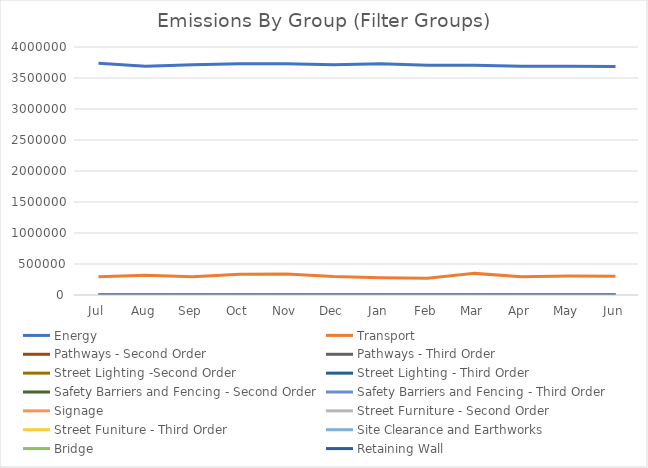
| Category | Energy | Transport | Pathways - Second Order | Pathways - Third Order | Street Lighting -Second Order | Street Lighting - Third Order | Safety Barriers and Fencing - Second Order | Safety Barriers and Fencing - Third Order | Signage | Street Furniture - Second Order | Street Funiture - Third Order | Site Clearance and Earthworks | Bridge | Retaining Wall |
|---|---|---|---|---|---|---|---|---|---|---|---|---|---|---|
| Jul | 3739475.92 | 295843.133 | 0 | 170.31 | 0 | 0 | 0 | 0 | 0 | 0 | 0 | 0 | 0 | 0 |
| Aug | 3689571.545 | 319998.625 | 0 | 1483 | 0 | 0 | 0 | 0 | 0 | 0 | 0 | 0 | 0 | 0 |
| Sep | 3714832.63 | 294915.596 | 0 | 1526 | 0 | 0 | 0 | 0 | 0 | 0 | 0 | 0 | 0 | 0 |
| Oct | 3731551.888 | 333237.089 | 0 | 6950 | 0 | 0 | 0 | 0 | 0 | 0 | 0 | 0 | 0 | 0 |
| Nov | 3729217.409 | 337195.329 | 0 | 5793 | 0 | 0 | 0 | 0 | 0 | 0 | 0 | 0 | 0 | 0 |
| Dec | 3712976.42 | 296564.337 | 0 | 1950 | 0 | 0 | 0 | 0 | 0 | 0 | 0 | 0 | 0 | 0 |
| Jan | 3730426.992 | 278044.453 | 0 | 4700 | 0 | 0 | 0 | 0 | 0 | 0 | 0 | 0 | 0 | 0 |
| Feb | 3703645.334 | 271372.331 | 0 | 8155 | 0 | 0 | 0 | 0 | 0 | 0 | 0 | 0 | 0 | 0 |
| Mar | 3704032.977 | 348712.223 | 0 | 7946 | 0 | 0 | 0 | 0 | 0 | 0 | 0 | 0 | 0 | 0 |
| Apr | 3691423.752 | 295271.242 | 0 | 4242 | 0 | 0 | 0 | 0 | 0 | 0 | 0 | 0 | 0 | 0 |
| May | 3689514.682 | 304919.352 | 0 | 1981.616 | 0 | 0 | 0 | 0 | 0 | 0 | 0 | 0 | 0 | 0 |
| Jun | 3683762.482 | 302613.412 | 0 | 990.808 | 0 | 0 | 0 | 0 | 0 | 0 | 0 | 0 | 0 | 0 |